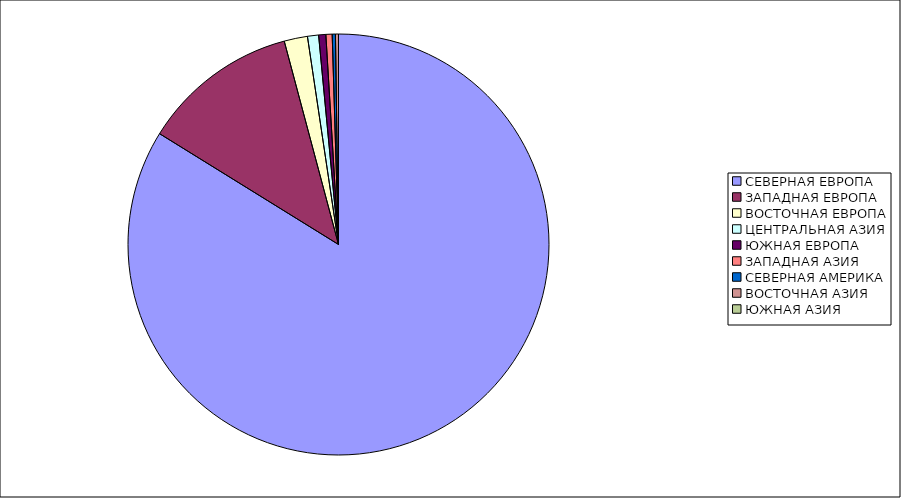
| Category | Оборот |
|---|---|
| СЕВЕРНАЯ ЕВРОПА | 83.824 |
| ЗАПАДНАЯ ЕВРОПА | 12.025 |
| ВОСТОЧНАЯ ЕВРОПА | 1.791 |
| ЦЕНТРАЛЬНАЯ АЗИЯ | 0.851 |
| ЮЖНАЯ ЕВРОПА | 0.552 |
| ЗАПАДНАЯ АЗИЯ | 0.48 |
| СЕВЕРНАЯ АМЕРИКА | 0.245 |
| ВОСТОЧНАЯ АЗИЯ | 0.232 |
| ЮЖНАЯ АЗИЯ | 0.001 |